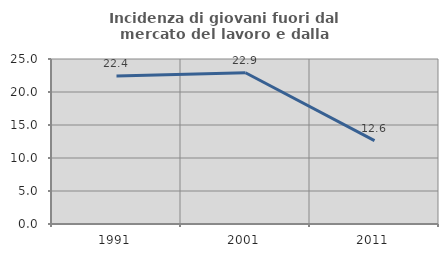
| Category | Incidenza di giovani fuori dal mercato del lavoro e dalla formazione  |
|---|---|
| 1991.0 | 22.434 |
| 2001.0 | 22.917 |
| 2011.0 | 12.637 |